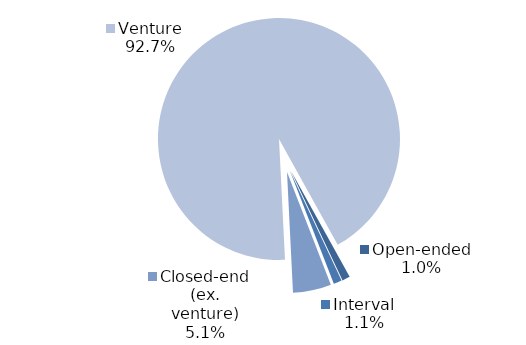
| Category | Series 0 |
|---|---|
| Open-ended | 17 |
| Interval | 18 |
| Closed-end (ex. venture) | 83 |
| Venture | 1506 |